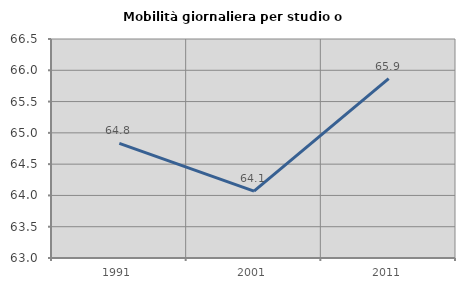
| Category | Mobilità giornaliera per studio o lavoro |
|---|---|
| 1991.0 | 64.831 |
| 2001.0 | 64.069 |
| 2011.0 | 65.867 |